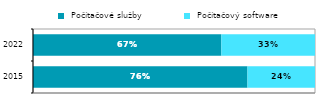
| Category |  Počítačové služby |  Počítačový software |
|---|---|---|
|  2015 | 0.761 | 0.239 |
| 2022 | 0.668 | 0.332 |